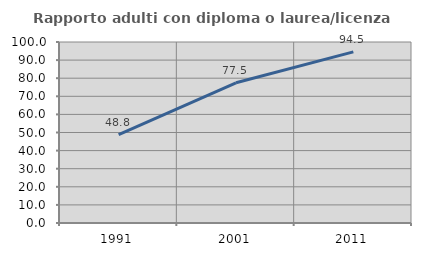
| Category | Rapporto adulti con diploma o laurea/licenza media  |
|---|---|
| 1991.0 | 48.78 |
| 2001.0 | 77.451 |
| 2011.0 | 94.545 |